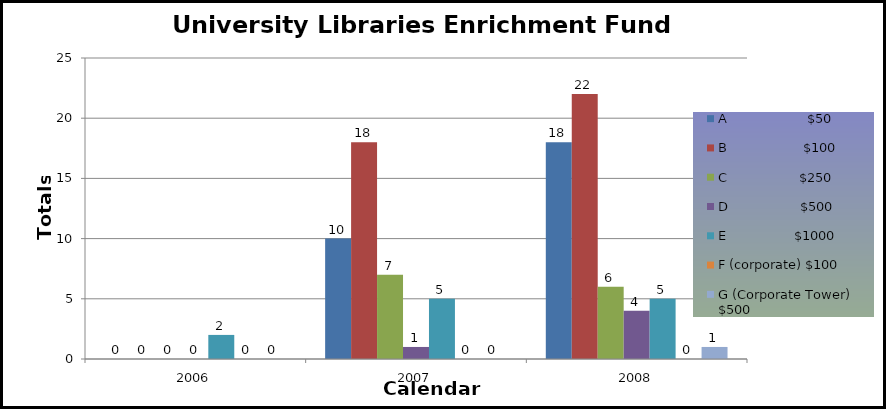
| Category | A                    $50 | B                   $100 | C                  $250 | D                  $500 | E                 $1000 | F (corporate) $100 | G (Corporate Tower) $500 |
|---|---|---|---|---|---|---|---|
| 2006.0 | 0 | 0 | 0 | 0 | 2 | 0 | 0 |
| 2007.0 | 10 | 18 | 7 | 1 | 5 | 0 | 0 |
| 2008.0 | 18 | 22 | 6 | 4 | 5 | 0 | 1 |